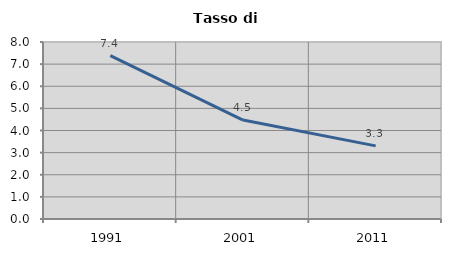
| Category | Tasso di disoccupazione   |
|---|---|
| 1991.0 | 7.38 |
| 2001.0 | 4.472 |
| 2011.0 | 3.306 |